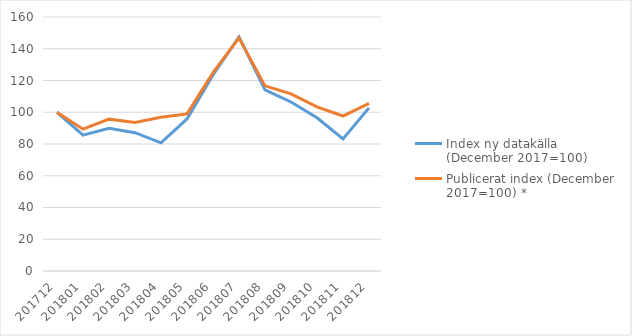
| Category | Index ny datakälla (December 2017=100) | Publicerat index (December 2017=100) * |
|---|---|---|
| 201712.0 | 100 | 100 |
| 201801.0 | 85.57 | 89.34 |
| 201802.0 | 89.88 | 95.65 |
| 201803.0 | 87.11 | 93.56 |
| 201804.0 | 80.73 | 96.89 |
| 201805.0 | 95.78 | 98.98 |
| 201806.0 | 123.45 | 124.9 |
| 201807.0 | 147.44 | 146.82 |
| 201808.0 | 114.08 | 116.62 |
| 201809.0 | 106.45 | 111.54 |
| 201810.0 | 96.52 | 103.43 |
| 201811.0 | 83.22 | 97.62 |
| 201812.0 | 102.75 | 105.55 |